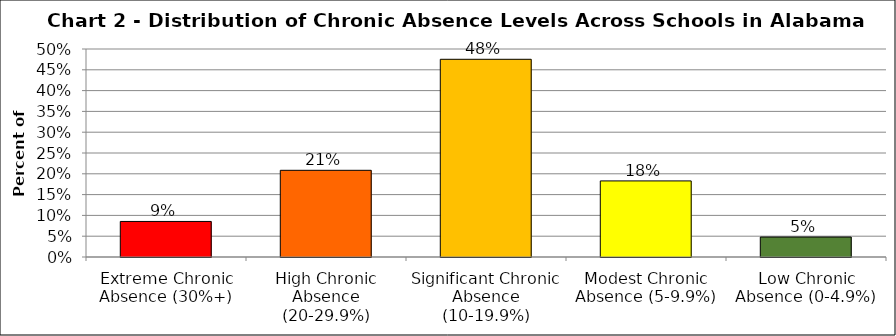
| Category | Series 1 |
|---|---|
| Extreme Chronic Absence (30%+) | 0.085 |
| High Chronic Absence (20-29.9%) | 0.208 |
| Significant Chronic Absence (10-19.9%) | 0.475 |
| Modest Chronic Absence (5-9.9%) | 0.183 |
| Low Chronic Absence (0-4.9%) | 0.048 |